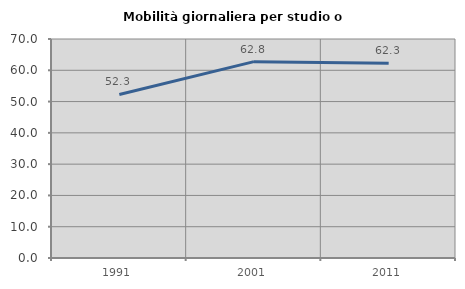
| Category | Mobilità giornaliera per studio o lavoro |
|---|---|
| 1991.0 | 52.276 |
| 2001.0 | 62.761 |
| 2011.0 | 62.277 |